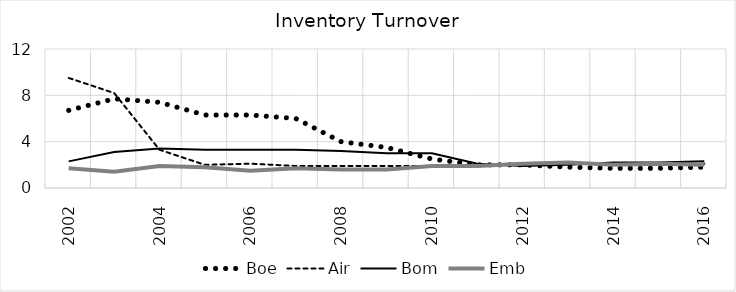
| Category | Boe | Air | Bom | Emb |
|---|---|---|---|---|
| 2002.0 | 6.7 | 9.5 | 2.3 | 1.7 |
| 2003.0 | 7.7 | 8.2 | 3.1 | 1.4 |
| 2004.0 | 7.4 | 3.3 | 3.4 | 1.9 |
| 2005.0 | 6.3 | 2 | 3.3 | 1.8 |
| 2006.0 | 6.3 | 2.1 | 3.3 | 1.5 |
| 2007.0 | 6 | 1.9 | 3.3 | 1.7 |
| 2008.0 | 4 | 1.9 | 3.2 | 1.6 |
| 2009.0 | 3.5 | 1.9 | 3 | 1.6 |
| 2010.0 | 2.5 | 1.9 | 3 | 1.9 |
| 2011.0 | 2 | 1.9 | 2.1 | 1.9 |
| 2012.0 | 2 | 2.1 | 1.9 | 2.1 |
| 2013.0 | 1.8 | 2.1 | 2 | 2.2 |
| 2014.0 | 1.7 | 2.1 | 2.2 | 2 |
| 2015.0 | 1.7 | 2 | 2.2 | 2.1 |
| 2016.0 | 1.8 | 2.1 | 2.3 | 2 |